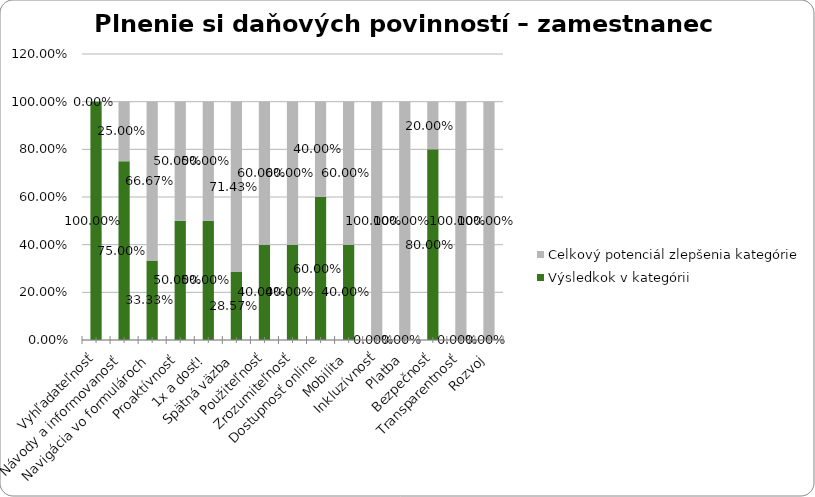
| Category | Výsledkok v kategórii | Celkový potenciál zlepšenia kategórie |
|---|---|---|
| Vyhľadateľnosť | 1 | 0 |
| Návody a informovanosť | 0.75 | 0.25 |
| Navigácia vo formulároch | 0.333 | 0.667 |
| Proaktívnosť | 0.5 | 0.5 |
| 1x a dosť! | 0.5 | 0.5 |
| Spätná väzba | 0.286 | 0.714 |
| Použiteľnosť | 0.4 | 0.6 |
| Zrozumiteľnosť | 0.4 | 0.6 |
| Dostupnosť online | 0.6 | 0.4 |
| Mobilita | 0.4 | 0.6 |
| Inkluzívnosť | 0 | 1 |
| Platba | 0 | 1 |
| Bezpečnosť | 0.8 | 0.2 |
| Transparentnosť | 0 | 1 |
| Rozvoj | 0 | 1 |